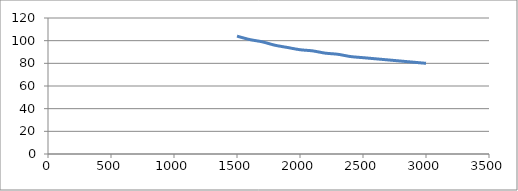
| Category | Series 0 |
|---|---|
| 1500.0 | 104 |
| 1600.0 | 101 |
| 1700.0 | 99 |
| 1800.0 | 96 |
| 1900.0 | 94 |
| 2000.0 | 92 |
| 2100.0 | 91 |
| 2200.0 | 89 |
| 2300.0 | 88 |
| 2400.0 | 86 |
| 2500.0 | 85 |
| 2600.0 | 84 |
| 2700.0 | 83 |
| 2800.0 | 82 |
| 2900.0 | 81 |
| 3000.0 | 80 |